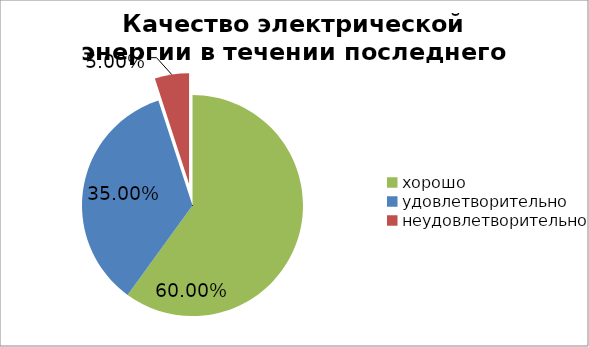
| Category | Series 1 |
|---|---|
| хорошо | 0.576 |
| удовлетворительно | 0.336 |
| неудовлетворительно | 0.048 |